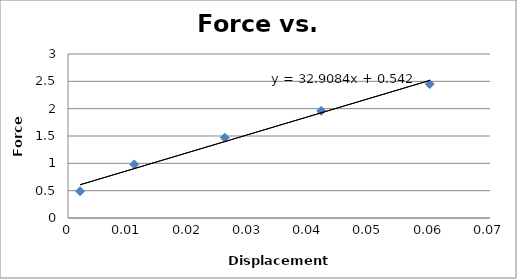
| Category | Series 0 |
|---|---|
| 0.002 | 0.49 |
| 0.011 | 0.98 |
| 0.026 | 1.47 |
| 0.042 | 1.96 |
| 0.06 | 2.45 |